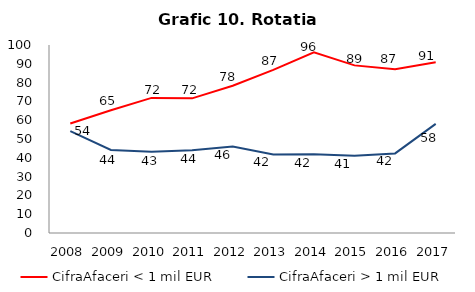
| Category | CifraAfaceri < 1 mil EUR | CifraAfaceri > 1 mil EUR |
|---|---|---|
| 2008.0 | 58.272 | 54.217 |
| 2009.0 | 65.282 | 44.21 |
| 2010.0 | 71.856 | 43.232 |
| 2011.0 | 71.632 | 44.009 |
| 2012.0 | 78.321 | 46.013 |
| 2013.0 | 86.738 | 41.801 |
| 2014.0 | 96.136 | 41.911 |
| 2015.0 | 89.155 | 41.072 |
| 2016.0 | 87.166 | 42.344 |
| 2017.0 | 90.841 | 58.014 |